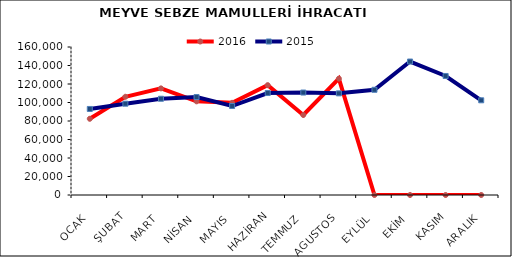
| Category | 2016 | 2015 |
|---|---|---|
| OCAK | 82387.498 | 93016.968 |
| ŞUBAT | 106196.985 | 98704.324 |
| MART | 115260.932 | 104051.439 |
| NİSAN | 101260.029 | 105917.708 |
| MAYIS | 99639.407 | 96206.019 |
| HAZİRAN | 118749.136 | 110250.83 |
| TEMMUZ | 86509.864 | 110761.126 |
| AGUSTOS | 125783.888 | 109877.848 |
| EYLÜL | 0 | 113742.676 |
| EKİM | 0 | 144274.669 |
| KASIM | 0 | 128667.887 |
| ARALIK | 0 | 102366.426 |